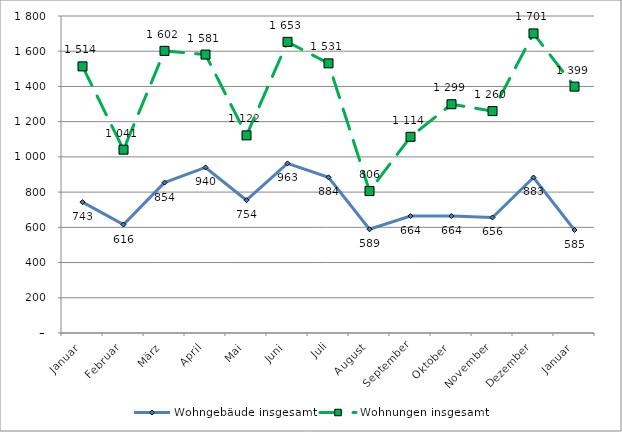
| Category | Wohngebäude insgesamt | Wohnungen insgesamt |
|---|---|---|
| Januar | 743 | 1514 |
| Februar | 616 | 1041 |
| März | 854 | 1602 |
| April | 940 | 1581 |
| Mai | 754 | 1122 |
| Juni | 963 | 1653 |
| Juli | 884 | 1531 |
| August | 589 | 806 |
| September | 664 | 1114 |
| Oktober | 664 | 1299 |
| November | 656 | 1260 |
| Dezember | 883 | 1701 |
| Januar | 585 | 1399 |